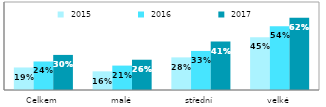
| Category |  2015 |  2016 |  2017 |
|---|---|---|---|
| Celkem | 0.192 | 0.243 | 0.299 |
| malé | 0.159 | 0.208 | 0.258 |
| střední | 0.278 | 0.333 | 0.413 |
| velké | 0.45 | 0.544 | 0.616 |